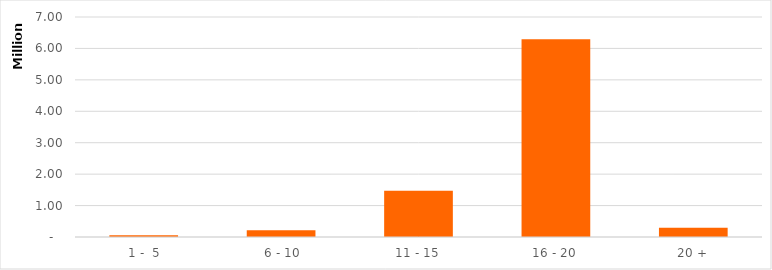
| Category | Series 0 |
|---|---|
|  1 -  5 | 54952.919 |
|  6 - 10 | 217791.88 |
| 11 - 15 | 1468859.247 |
| 16 - 20 | 6294086.621 |
| 20 + | 293225.873 |